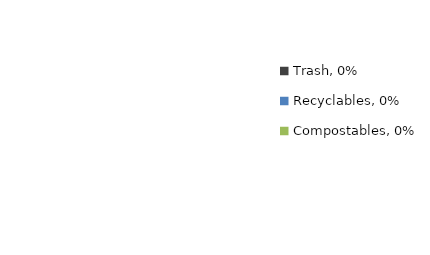
| Category | Series 0 |
|---|---|
| Trash, 0% | 0 |
| Recyclables, 0% | 0 |
| Compostables, 0% | 0 |